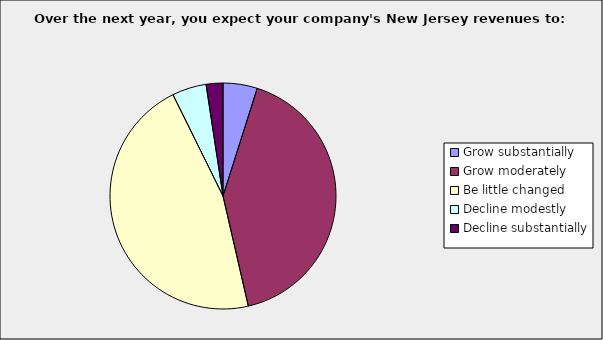
| Category | Series 0 |
|---|---|
| Grow substantially | 0.049 |
| Grow moderately | 0.415 |
| Be little changed | 0.463 |
| Decline modestly | 0.049 |
| Decline substantially | 0.024 |